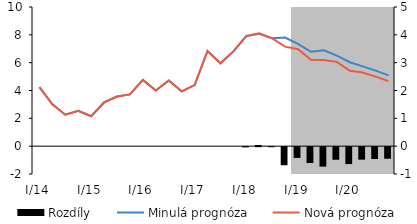
| Category | Rozdíly |
|---|---|
| I/14 | 0 |
| II | 0 |
| III | 0 |
| IV | 0 |
| I/15 | 0 |
| II | 0 |
| III | 0 |
| IV | 0 |
| I/16 | 0 |
| II | 0 |
| III | 0 |
| IV | 0 |
| I/17 | 0 |
| II | 0 |
| III | 0 |
| IV | 0 |
| I/18 | -0.008 |
| II | 0.041 |
| III | -0.001 |
| IV | -0.649 |
| I/19 | -0.386 |
| II | -0.57 |
| III | -0.699 |
| IV | -0.452 |
| I/20 | -0.607 |
| II | -0.449 |
| III | -0.426 |
| IV | -0.415 |